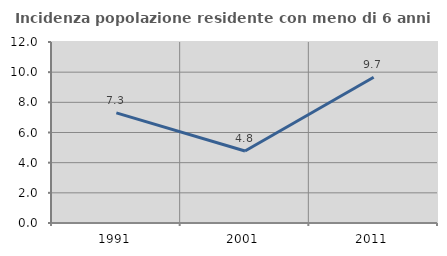
| Category | Incidenza popolazione residente con meno di 6 anni |
|---|---|
| 1991.0 | 7.303 |
| 2001.0 | 4.775 |
| 2011.0 | 9.663 |